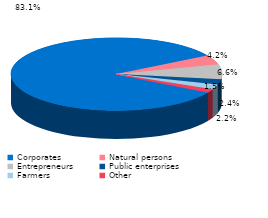
| Category | Series 0 |
|---|---|
| Corporates | 0.831 |
| Natural persons | 0.042 |
| Entrepreneurs | 0.066 |
| Public enterprises | 0.024 |
| Farmers | 0.022 |
| Other | 0.015 |